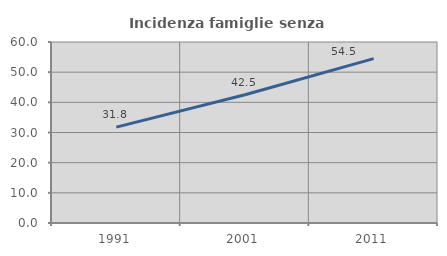
| Category | Incidenza famiglie senza nuclei |
|---|---|
| 1991.0 | 31.784 |
| 2001.0 | 42.515 |
| 2011.0 | 54.499 |